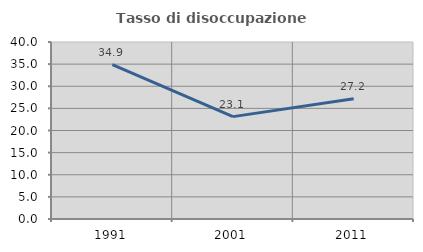
| Category | Tasso di disoccupazione giovanile  |
|---|---|
| 1991.0 | 34.894 |
| 2001.0 | 23.134 |
| 2011.0 | 27.174 |